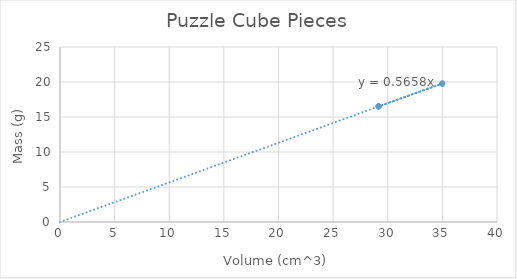
| Category | Series 0 |
|---|---|
| 29.16 | 16.55 |
| 29.16 | 16.45 |
| 29.16 | 16.55 |
| 34.99 | 19.72 |
| 34.99 | 19.83 |